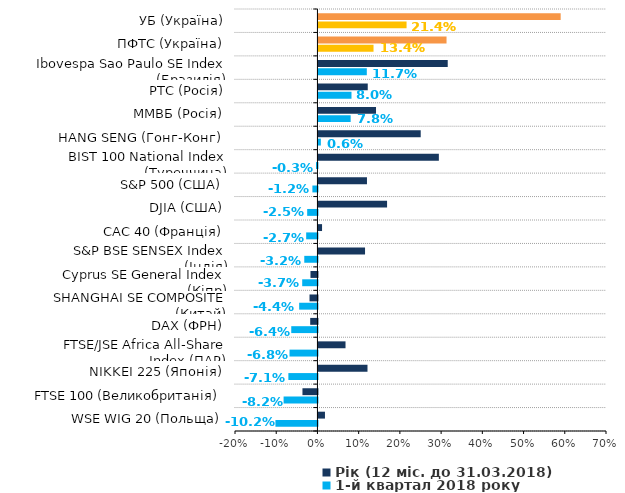
| Category | 1-й квартал 2018 року | Рік (12 міс. до 31.03.2018) |
|---|---|---|
| WSE WIG 20 (Польща) | -0.102 | 0.016 |
| FTSE 100 (Великобританія) | -0.082 | -0.036 |
| NIKKEI 225 (Японія) | -0.071 | 0.119 |
| FTSE/JSE Africa All-Share Index (ПАР) | -0.068 | 0.066 |
| DAX (ФРН) | -0.064 | -0.018 |
| SHANGHAI SE COMPOSITE (Китай) | -0.044 | -0.019 |
| Cyprus SE General Index (Кіпр) | -0.037 | -0.017 |
| S&P BSE SENSEX Index (Індія) | -0.032 | 0.113 |
| CAC 40 (Франція) | -0.027 | 0.009 |
| DJIA (США) | -0.025 | 0.166 |
| S&P 500 (США) | -0.012 | 0.118 |
| BIST 100 National Index (Туреччина) | -0.003 | 0.292 |
| HANG SENG (Гонг-Конг) | 0.006 | 0.248 |
| ММВБ (Росія) | 0.078 | 0.14 |
| РТС (Росія) | 0.08 | 0.12 |
| Ibovespa Sao Paulo SE Index (Бразилія) | 0.117 | 0.314 |
| ПФТС (Україна) | 0.134 | 0.311 |
| УБ (Україна) | 0.214 | 0.588 |